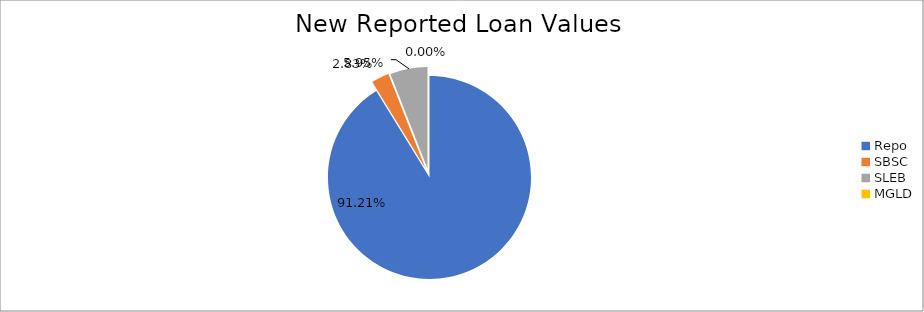
| Category | Series 0 |
|---|---|
| Repo | 9160084.832 |
| SBSC | 284572.733 |
| SLEB | 597704.453 |
| MGLD | 94.94 |